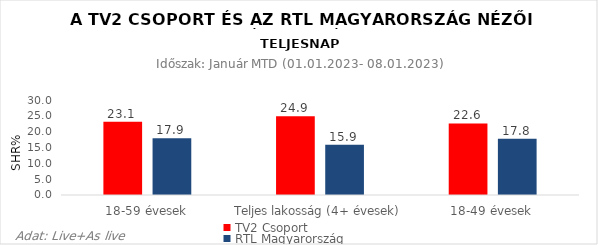
| Category | TV2 Csoport | RTL Magyarország |
|---|---|---|
| 18-59 évesek | 23.1 | 17.9 |
| Teljes lakosság (4+ évesek) | 24.9 | 15.9 |
| 18-49 évesek | 22.6 | 17.8 |